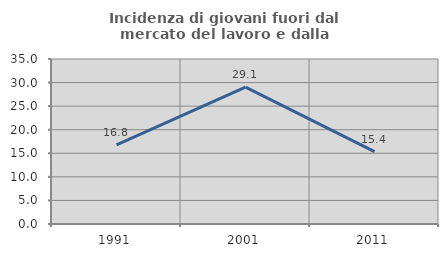
| Category | Incidenza di giovani fuori dal mercato del lavoro e dalla formazione  |
|---|---|
| 1991.0 | 16.779 |
| 2001.0 | 29.052 |
| 2011.0 | 15.357 |